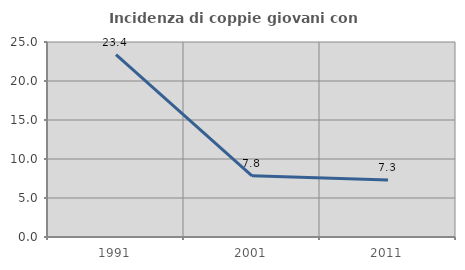
| Category | Incidenza di coppie giovani con figli |
|---|---|
| 1991.0 | 23.394 |
| 2001.0 | 7.848 |
| 2011.0 | 7.302 |